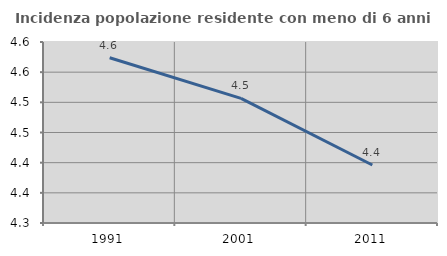
| Category | Incidenza popolazione residente con meno di 6 anni |
|---|---|
| 1991.0 | 4.574 |
| 2001.0 | 4.507 |
| 2011.0 | 4.396 |